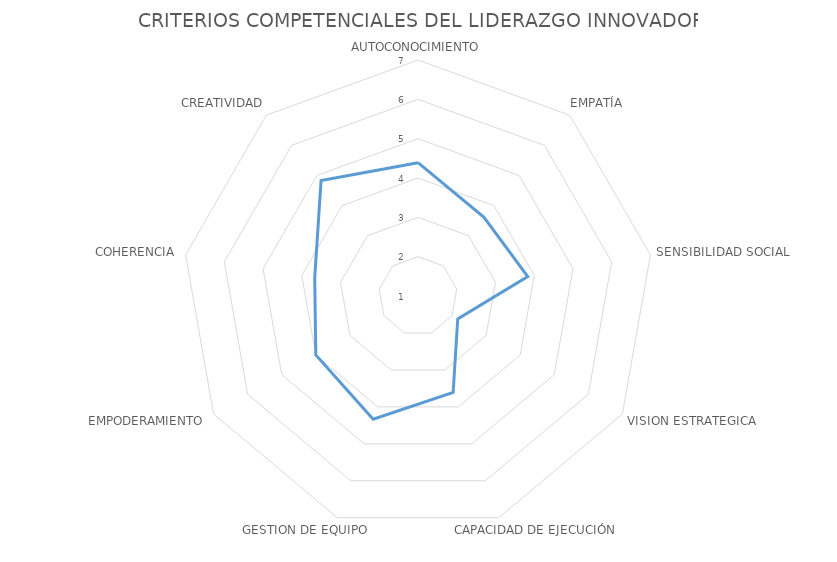
| Category | CRITERIOS COMPETENCIALES DEL LIDERAZGO INNOVADOR |
|---|---|
| AUTOCONOCIMIENTO | 4.389 |
| EMPATÍA | 3.611 |
| SENSIBILIDAD SOCIAL | 3.833 |
| VISION ESTRATEGICA | 2.167 |
| CAPACIDAD DE EJECUCIÓN | 3.611 |
| GESTION DE EQUIPO | 4.333 |
| EMPODERAMIENTO | 4 |
| COHERENCIA | 3.667 |
| CREATIVIDAD | 4.833 |